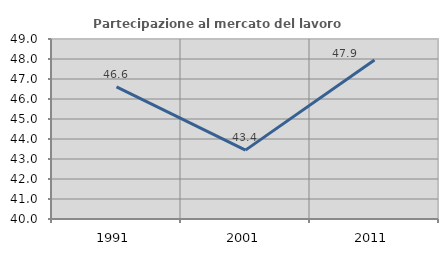
| Category | Partecipazione al mercato del lavoro  femminile |
|---|---|
| 1991.0 | 46.604 |
| 2001.0 | 43.444 |
| 2011.0 | 47.948 |